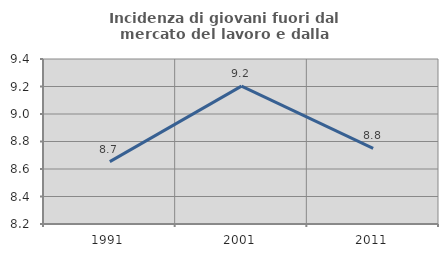
| Category | Incidenza di giovani fuori dal mercato del lavoro e dalla formazione  |
|---|---|
| 1991.0 | 8.654 |
| 2001.0 | 9.202 |
| 2011.0 | 8.75 |